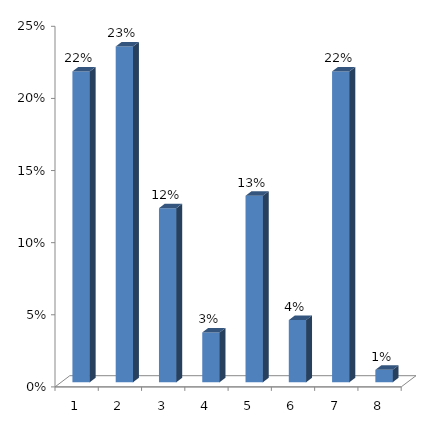
| Category | Series 0 |
|---|---|
| 0 | 0.216 |
| 1 | 0.233 |
| 2 | 0.121 |
| 3 | 0.034 |
| 4 | 0.129 |
| 5 | 0.043 |
| 6 | 0.216 |
| 7 | 0.009 |